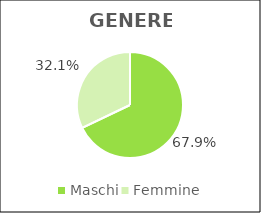
| Category | Series 0 |
|---|---|
| Maschi | 47673 |
| Femmine | 22540 |